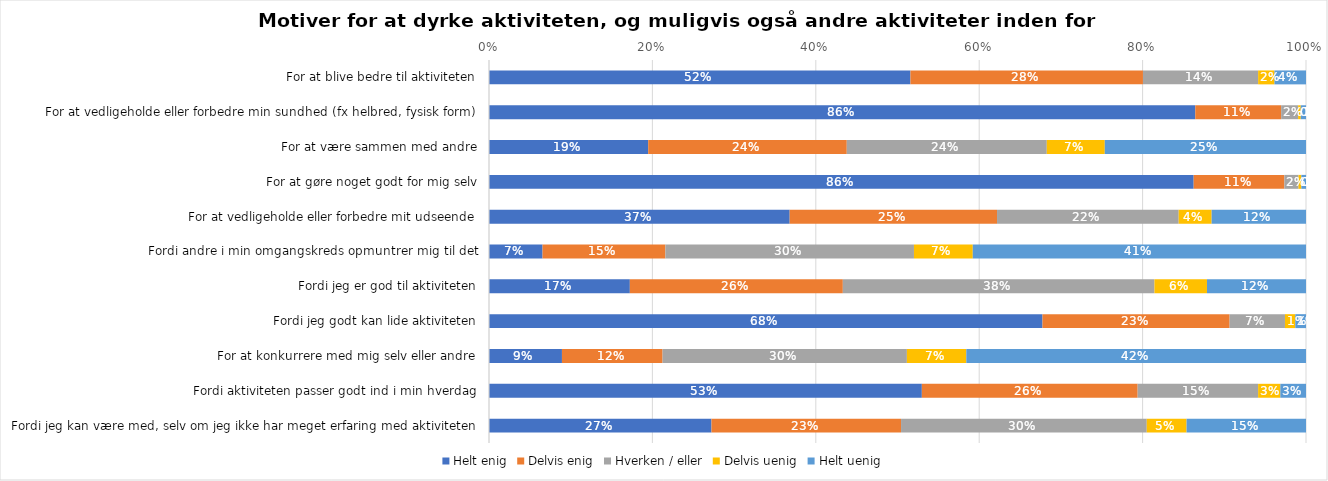
| Category | Helt enig | Delvis enig | Hverken / eller | Delvis uenig | Helt uenig |
|---|---|---|---|---|---|
| For at blive bedre til aktiviteten | 0.516 | 0.285 | 0.141 | 0.02 | 0.039 |
| For at vedligeholde eller forbedre min sundhed (fx helbred, fysisk form) | 0.864 | 0.105 | 0.021 | 0.003 | 0.006 |
| For at være sammen med andre | 0.195 | 0.243 | 0.245 | 0.071 | 0.246 |
| For at gøre noget godt for mig selv | 0.863 | 0.111 | 0.017 | 0.003 | 0.006 |
| For at vedligeholde eller forbedre mit udseende | 0.368 | 0.254 | 0.222 | 0.04 | 0.116 |
| Fordi andre i min omgangskreds opmuntrer mig til det | 0.066 | 0.15 | 0.304 | 0.072 | 0.408 |
| Fordi jeg er god til aktiviteten | 0.172 | 0.261 | 0.381 | 0.064 | 0.121 |
| Fordi jeg godt kan lide aktiviteten | 0.677 | 0.229 | 0.068 | 0.013 | 0.013 |
| For at konkurrere med mig selv eller andre | 0.089 | 0.123 | 0.299 | 0.073 | 0.416 |
| Fordi aktiviteten passer godt ind i min hverdag | 0.53 | 0.264 | 0.147 | 0.027 | 0.031 |
| Fordi jeg kan være med, selv om jeg ikke har meget erfaring med aktiviteten | 0.272 | 0.232 | 0.301 | 0.049 | 0.146 |